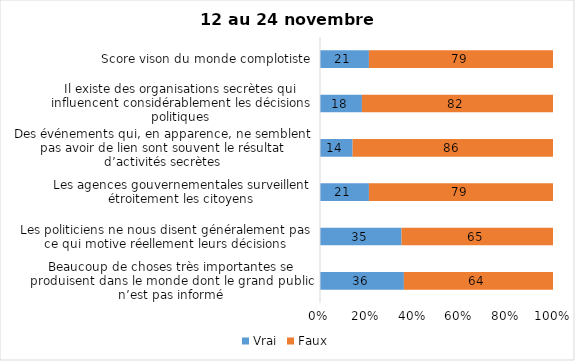
| Category | Vrai | Faux |
|---|---|---|
| Beaucoup de choses très importantes se produisent dans le monde dont le grand public n’est pas informé | 36 | 64 |
| Les politiciens ne nous disent généralement pas ce qui motive réellement leurs décisions | 35 | 65 |
| Les agences gouvernementales surveillent étroitement les citoyens | 21 | 79 |
| Des événements qui, en apparence, ne semblent pas avoir de lien sont souvent le résultat d’activités secrètes | 14 | 86 |
| Il existe des organisations secrètes qui influencent considérablement les décisions politiques | 18 | 82 |
| Score vison du monde complotiste | 21 | 79 |